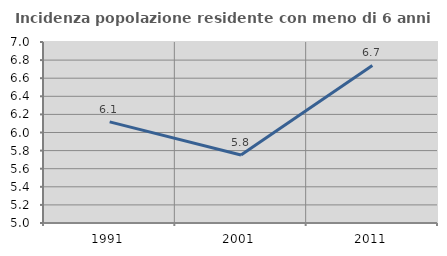
| Category | Incidenza popolazione residente con meno di 6 anni |
|---|---|
| 1991.0 | 6.118 |
| 2001.0 | 5.752 |
| 2011.0 | 6.742 |